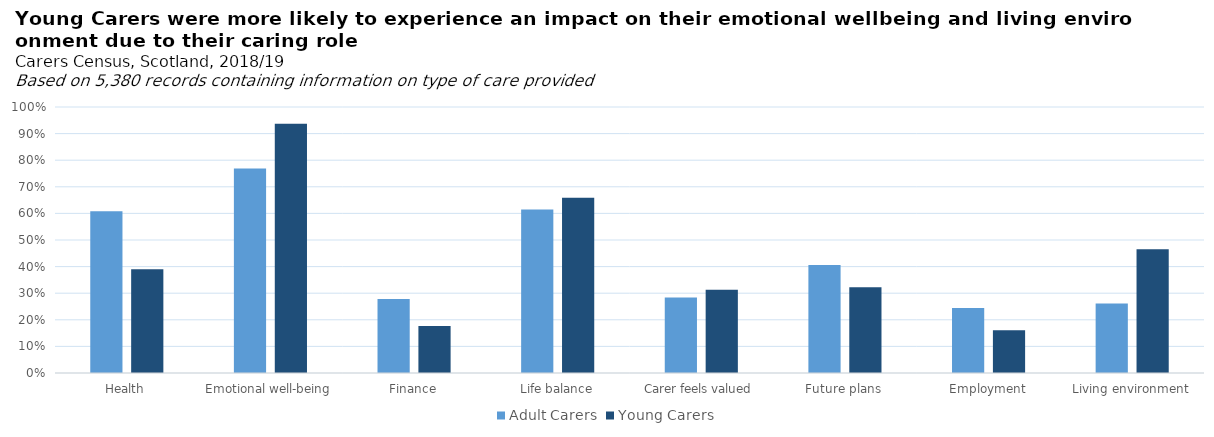
| Category | Adult Carers | Young Carers |
|---|---|---|
| Health | 0.608 | 0.39 |
| Emotional well-being | 0.769 | 0.937 |
| Finance | 0.278 | 0.177 |
| Life balance | 0.614 | 0.659 |
| Carer feels valued | 0.284 | 0.313 |
| Future plans | 0.406 | 0.322 |
| Employment | 0.244 | 0.161 |
| Living environment | 0.261 | 0.466 |